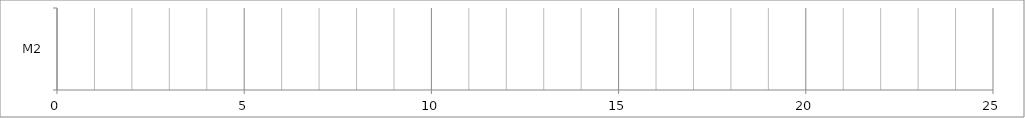
| Category | X | 0 | Series 4 | Series 5 |
|---|---|---|---|---|
| M2 | 0 | 0 |  |  |